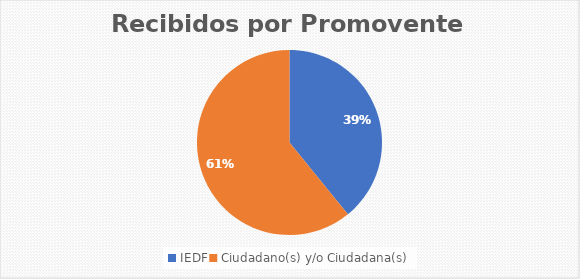
| Category | Series 0 |
|---|---|
| IEDF | 9 |
| Ciudadano(s) y/o Ciudadana(s) | 14 |